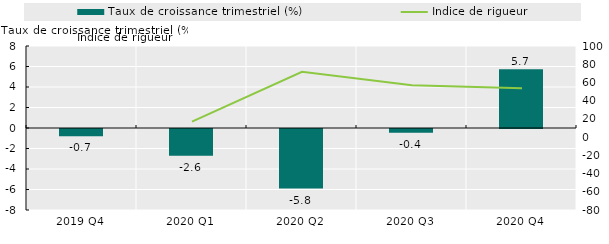
| Category | Taux de croissance trimestriel (%) |
|---|---|
| 2019 Q4 | -0.711 |
| 2020 Q1 | -2.613 |
| 2020 Q2 | -5.814 |
| 2020 Q3 | -0.37 |
| 2020 Q4 | 5.743 |